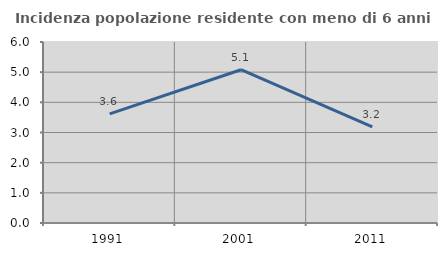
| Category | Incidenza popolazione residente con meno di 6 anni |
|---|---|
| 1991.0 | 3.617 |
| 2001.0 | 5.08 |
| 2011.0 | 3.184 |